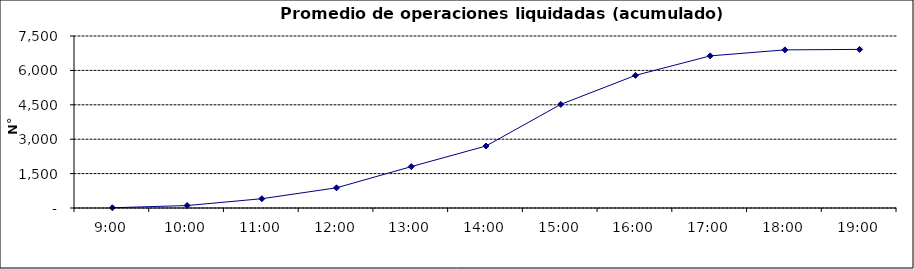
| Category | Promedio Op.Liquidadas (acumulado) |
|---|---|
| 0.375 | 10.81 |
| 0.4166666666666667 | 106.81 |
| 0.4583333333333333 | 405.381 |
| 0.5 | 880.619 |
| 0.5416666666666666 | 1804.381 |
| 0.5833333333333334 | 2702.81 |
| 0.625 | 4518.048 |
| 0.6666666666666666 | 5783.714 |
| 0.7083333333333334 | 6632.762 |
| 0.75 | 6894.476 |
| 0.7916666666666666 | 6916 |